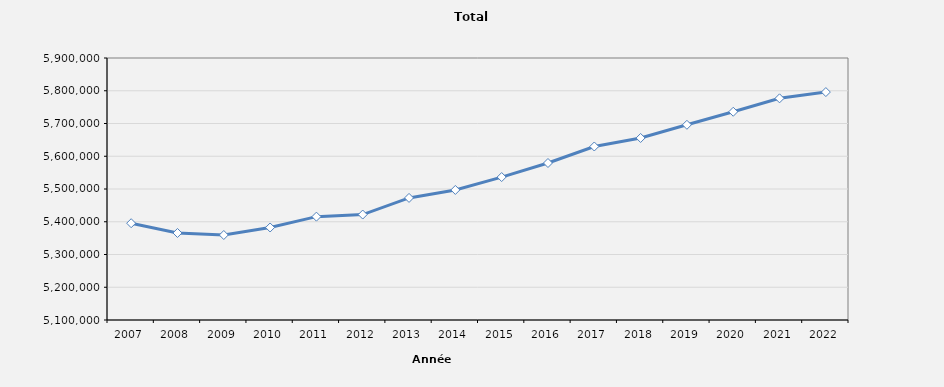
| Category | Total effectifs |
|---|---|
| 2007.0 | 5395548 |
| 2008.0 | 5365725 |
| 2009.0 | 5359527 |
| 2010.0 | 5382470 |
| 2011.0 | 5415587 |
| 2012.0 | 5421987 |
| 2013.0 | 5472782 |
| 2014.0 | 5497135 |
| 2015.0 | 5536422 |
| 2016.0 | 5579355 |
| 2017.0 | 5629777 |
| 2018.0 | 5655811 |
| 2019.0 | 5696040 |
| 2020.0 | 5735864 |
| 2021.0 | 5776833 |
| 2022.0 | 5795947 |